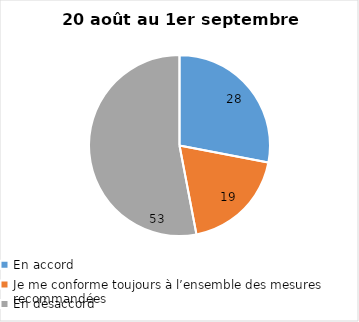
| Category | Series 0 |
|---|---|
| En accord | 28 |
| Je me conforme toujours à l’ensemble des mesures recommandées | 19 |
| En désaccord | 53 |